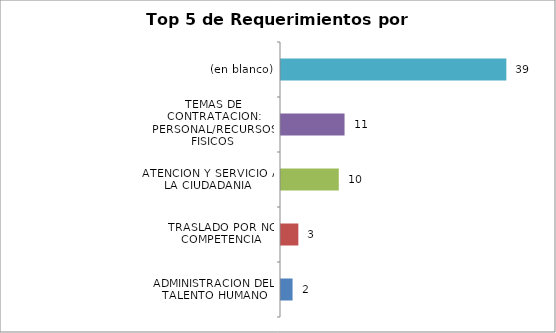
| Category | Total |
|---|---|
| ADMINISTRACION DEL TALENTO HUMANO | 2 |
| TRASLADO POR NO COMPETENCIA | 3 |
| ATENCION Y SERVICIO A LA CIUDADANIA | 10 |
| TEMAS DE CONTRATACION: PERSONAL/RECURSOS FISICOS | 11 |
| (en blanco) | 39 |